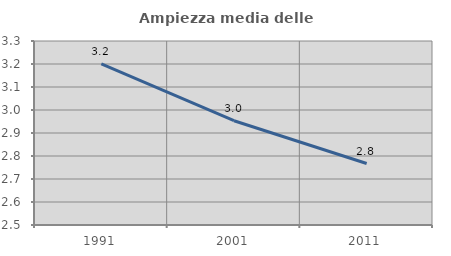
| Category | Ampiezza media delle famiglie |
|---|---|
| 1991.0 | 3.201 |
| 2001.0 | 2.953 |
| 2011.0 | 2.767 |